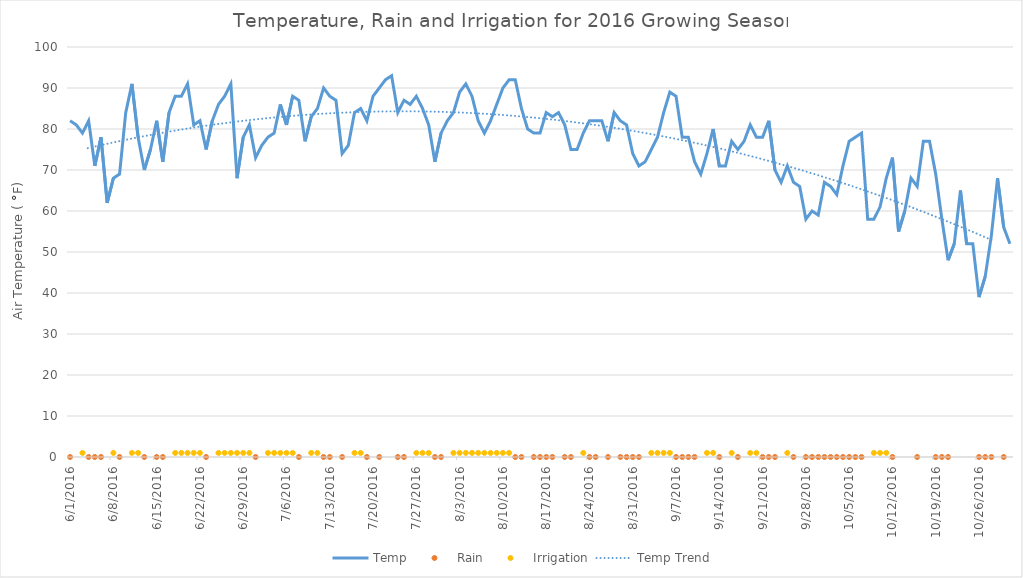
| Category | Temp |
|---|---|
| 6/1/16 | 82 |
| 6/2/16 | 81 |
| 6/3/16 | 79 |
| 6/4/16 | 82 |
| 6/5/16 | 71 |
| 6/6/16 | 78 |
| 6/7/16 | 62 |
| 6/8/16 | 68 |
| 6/9/16 | 69 |
| 6/10/16 | 84 |
| 6/11/16 | 91 |
| 6/12/16 | 78 |
| 6/13/16 | 70 |
| 6/14/16 | 75 |
| 6/15/16 | 82 |
| 6/16/16 | 72 |
| 6/17/16 | 84 |
| 6/18/16 | 88 |
| 6/19/16 | 88 |
| 6/20/16 | 91 |
| 6/21/16 | 81 |
| 6/22/16 | 82 |
| 6/23/16 | 75 |
| 6/24/16 | 82 |
| 6/25/16 | 86 |
| 6/26/16 | 88 |
| 6/27/16 | 91 |
| 6/28/16 | 68 |
| 6/29/16 | 78 |
| 6/30/16 | 81 |
| 7/1/16 | 73 |
| 7/2/16 | 76 |
| 7/3/16 | 78 |
| 7/4/16 | 79 |
| 7/5/16 | 86 |
| 7/6/16 | 81 |
| 7/7/16 | 88 |
| 7/8/16 | 87 |
| 7/9/16 | 77 |
| 7/10/16 | 83 |
| 7/11/16 | 85 |
| 7/12/16 | 90 |
| 7/13/16 | 88 |
| 7/14/16 | 87 |
| 7/15/16 | 74 |
| 7/16/16 | 76 |
| 7/17/16 | 84 |
| 7/18/16 | 85 |
| 7/19/16 | 82 |
| 7/20/16 | 88 |
| 7/21/16 | 90 |
| 7/22/16 | 92 |
| 7/23/16 | 93 |
| 7/24/16 | 84 |
| 7/25/16 | 87 |
| 7/26/16 | 86 |
| 7/27/16 | 88 |
| 7/28/16 | 85 |
| 7/29/16 | 81 |
| 7/30/16 | 72 |
| 7/31/16 | 79 |
| 8/1/16 | 82 |
| 8/2/16 | 84 |
| 8/3/16 | 89 |
| 8/4/16 | 91 |
| 8/5/16 | 88 |
| 8/6/16 | 82 |
| 8/7/16 | 79 |
| 8/8/16 | 82 |
| 8/9/16 | 86 |
| 8/10/16 | 90 |
| 8/11/16 | 92 |
| 8/12/16 | 92 |
| 8/13/16 | 85 |
| 8/14/16 | 80 |
| 8/15/16 | 79 |
| 8/16/16 | 79 |
| 8/17/16 | 84 |
| 8/18/16 | 83 |
| 8/19/16 | 84 |
| 8/20/16 | 81 |
| 8/21/16 | 75 |
| 8/22/16 | 75 |
| 8/23/16 | 79 |
| 8/24/16 | 82 |
| 8/25/16 | 82 |
| 8/26/16 | 82 |
| 8/27/16 | 77 |
| 8/28/16 | 84 |
| 8/29/16 | 82 |
| 8/30/16 | 81 |
| 8/31/16 | 74 |
| 9/1/16 | 71 |
| 9/2/16 | 72 |
| 9/3/16 | 75 |
| 9/4/16 | 78 |
| 9/5/16 | 84 |
| 9/6/16 | 89 |
| 9/7/16 | 88 |
| 9/8/16 | 78 |
| 9/9/16 | 78 |
| 9/10/16 | 72 |
| 9/11/16 | 69 |
| 9/12/16 | 74 |
| 9/13/16 | 80 |
| 9/14/16 | 71 |
| 9/15/16 | 71 |
| 9/16/16 | 77 |
| 9/17/16 | 75 |
| 9/18/16 | 77 |
| 9/19/16 | 81 |
| 9/20/16 | 78 |
| 9/21/16 | 78 |
| 9/22/16 | 82 |
| 9/23/16 | 70 |
| 9/24/16 | 67 |
| 9/25/16 | 71 |
| 9/26/16 | 67 |
| 9/27/16 | 66 |
| 9/28/16 | 58 |
| 9/29/16 | 60 |
| 9/30/16 | 59 |
| 10/1/16 | 67 |
| 10/2/16 | 66 |
| 10/3/16 | 64 |
| 10/4/16 | 71 |
| 10/5/16 | 77 |
| 10/6/16 | 78 |
| 10/7/16 | 79 |
| 10/8/16 | 58 |
| 10/9/16 | 58 |
| 10/10/16 | 61 |
| 10/11/16 | 68 |
| 10/12/16 | 73 |
| 10/13/16 | 55 |
| 10/14/16 | 60 |
| 10/15/16 | 68 |
| 10/16/16 | 66 |
| 10/17/16 | 77 |
| 10/18/16 | 77 |
| 10/19/16 | 69 |
| 10/20/16 | 58 |
| 10/21/16 | 48 |
| 10/22/16 | 52 |
| 10/23/16 | 65 |
| 10/24/16 | 52 |
| 10/25/16 | 52 |
| 10/26/16 | 39 |
| 10/27/16 | 44 |
| 10/28/16 | 54 |
| 10/29/16 | 68 |
| 10/30/16 | 56 |
| 10/31/16 | 52 |